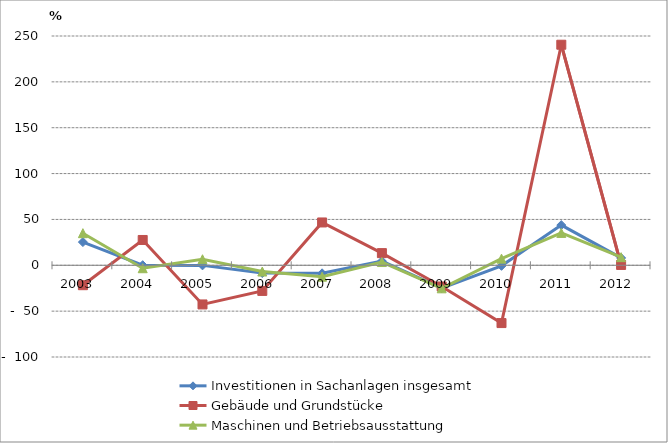
| Category | Investitionen in Sachanlagen insgesamt | Gebäude und Grundstücke | Maschinen und Betriebsausstattung |
|---|---|---|---|
| 2003.0 | 25.3 | -21.7 | 35 |
| 2004.0 | 0.1 | 27.6 | -3.2 |
| 2005.0 | -0.1 | -42.7 | 6.6 |
| 2006.0 | -8.473 | -27.938 | -6.81 |
| 2007.0 | -8.766 | 46.686 | -12.43 |
| 2008.0 | 4.511 | 13.27 | 3.542 |
| 2009.0 | -24.896 | -23.131 | -25.113 |
| 2010.0 | -0.603 | -63.013 | 7.236 |
| 2011.0 | 43.839 | 240.491 | 35.319 |
| 2012.0 | 8.013 | 0.373 | 8.846 |